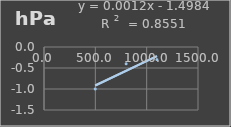
| Category | Presión Admosferica |
|---|---|
| 499.0 | -1 |
| 799.8 | -0.4 |
| 1099.9 | -0.3 |